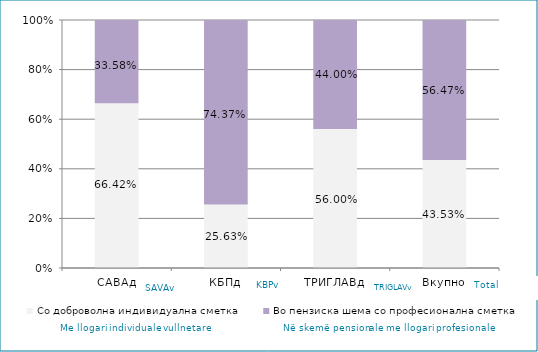
| Category | Со доброволна индивидуална сметка  | Во пензиска шема со професионална сметка |
|---|---|---|
| САВАд | 0.664 | 0.336 |
| КБПд | 0.256 | 0.744 |
| ТРИГЛАВд | 0.56 | 0.44 |
| Вкупно | 0.435 | 0.565 |